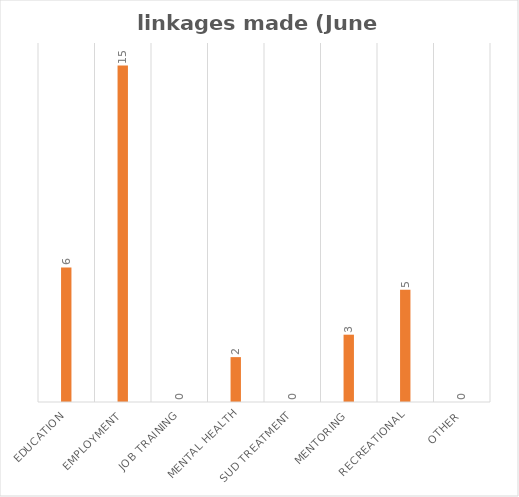
| Category | Series 0 |
|---|---|
| Education | 6 |
| Employment | 15 |
| Job Training | 0 |
| Mental Health | 2 |
| SUD Treatment | 0 |
| Mentoring | 3 |
| Recreational | 5 |
| Other | 0 |